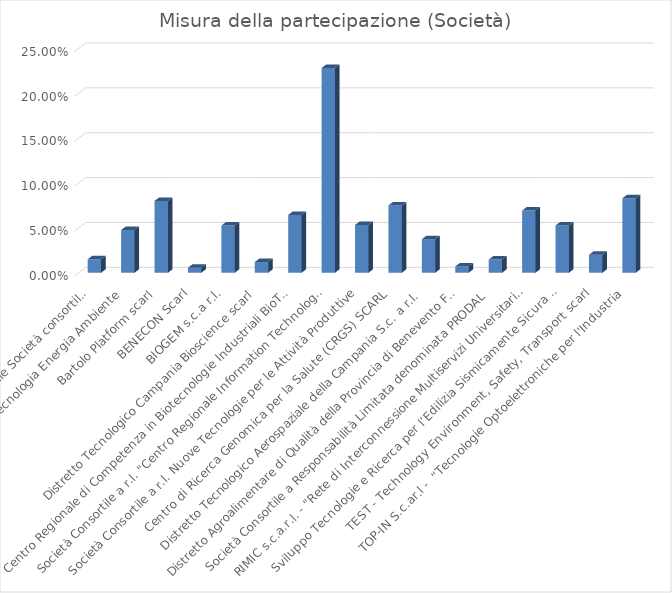
| Category | Misura della partecipazione |
|---|---|
| AMRA Analisi e Monitoraggio Rischio Ambientale Società consortile a r.l. in liquidazione | 0.015 |
| Atena scarl - Distretto Alta Tecnologia Energia Ambiente | 0.048 |
| Bartolo Platform scarl | 0.08 |
| BENECON Scarl | 0.006 |
| BIOGEM s.c.a r.l. | 0.053 |
| Distretto Tecnologico Campania Bioscience scarl | 0.012 |
| Centro Regionale di Competenza in Biotecnologie Industriali BioTekNet S.c.p.a. | 0.064 |
| Società Consortile a r.l. "Centro Regionale Information Technology" | 0.228 |
| Società Consortile a r.l. Nuove Tecnologie per le Attività Produttive | 0.053 |
| Centro di Ricerca Genomica per la Salute (CRGS) SCARL | 0.075 |
| Distretto Tecnologico Aerospaziale della Campania S.c. a r.l. | 0.037 |
| Distretto Agroalimentare di Qualità della Provincia di Benevento Filiera Vitivinicola e Filiere Olivicola e Ortofrutta Società Consortile a r.l | 0.007 |
| Società Consortile a Responsabilità Limitata denominata PRODAL | 0.015 |
| RIMIC s.c.a.r.l. - "Rete di Interconnessione Multiservizi Universitaria Campana in liquidazione | 0.069 |
| Sviluppo Tecnologie e Ricerca per l’Edilizia Sismicamente Sicura ed Ecosostenibile | 0.053 |
| TEST - Technology Environment, Safety, Transport scarl | 0.02 |
| TOP-IN S.c.ar.l -  “Tecnologie Optoelettroniche per l'Industria | 0.083 |